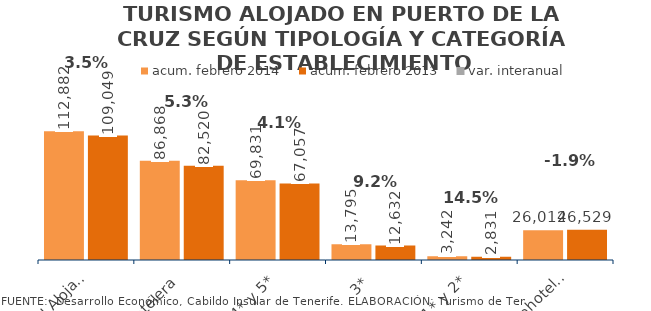
| Category | acum. febrero 2014 | acum. febrero 2013 |
|---|---|---|
| Total Alojados | 112882 | 109049 |
| Hotelera | 86868 | 82520 |
| 4* y 5* | 69831 | 67057 |
| 3* | 13795 | 12632 |
| 1* y 2* | 3242 | 2831 |
| Extrahotelera | 26014 | 26529 |